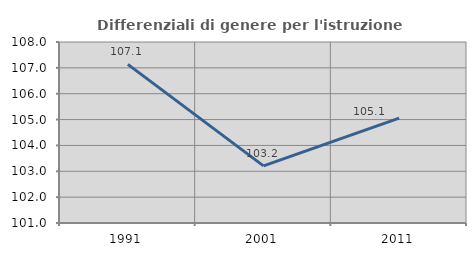
| Category | Differenziali di genere per l'istruzione superiore |
|---|---|
| 1991.0 | 107.136 |
| 2001.0 | 103.21 |
| 2011.0 | 105.058 |